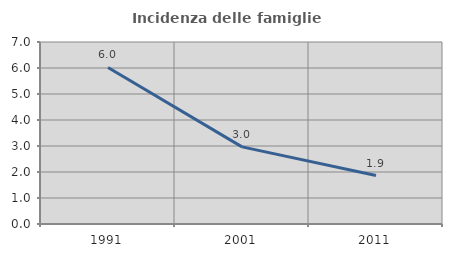
| Category | Incidenza delle famiglie numerose |
|---|---|
| 1991.0 | 6.021 |
| 2001.0 | 2.965 |
| 2011.0 | 1.864 |